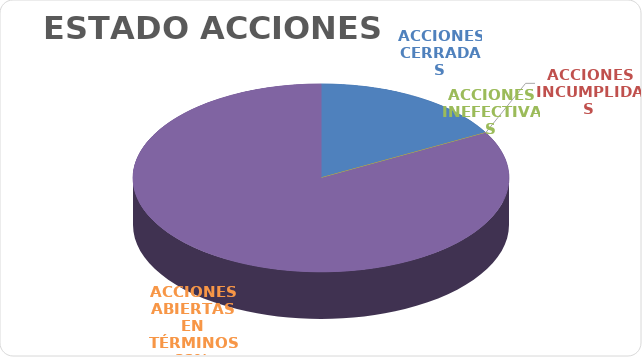
| Category | Series 0 |
|---|---|
| ACCIONES CERRADAS | 17 |
| ACCIONES INCUMPLIDAS | 0 |
| ACCIONES INEFECTIVAS | 0 |
| ACCIONES ABIERTAS EN TÉRMINOS | 83 |